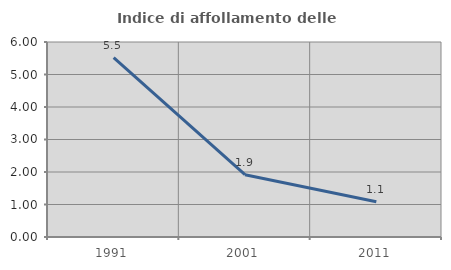
| Category | Indice di affollamento delle abitazioni  |
|---|---|
| 1991.0 | 5.52 |
| 2001.0 | 1.918 |
| 2011.0 | 1.085 |